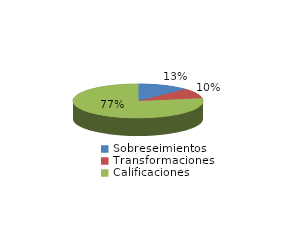
| Category | Series 0 |
|---|---|
| Sobreseimientos | 305 |
| Transformaciones | 229 |
| Calificaciones | 1832 |